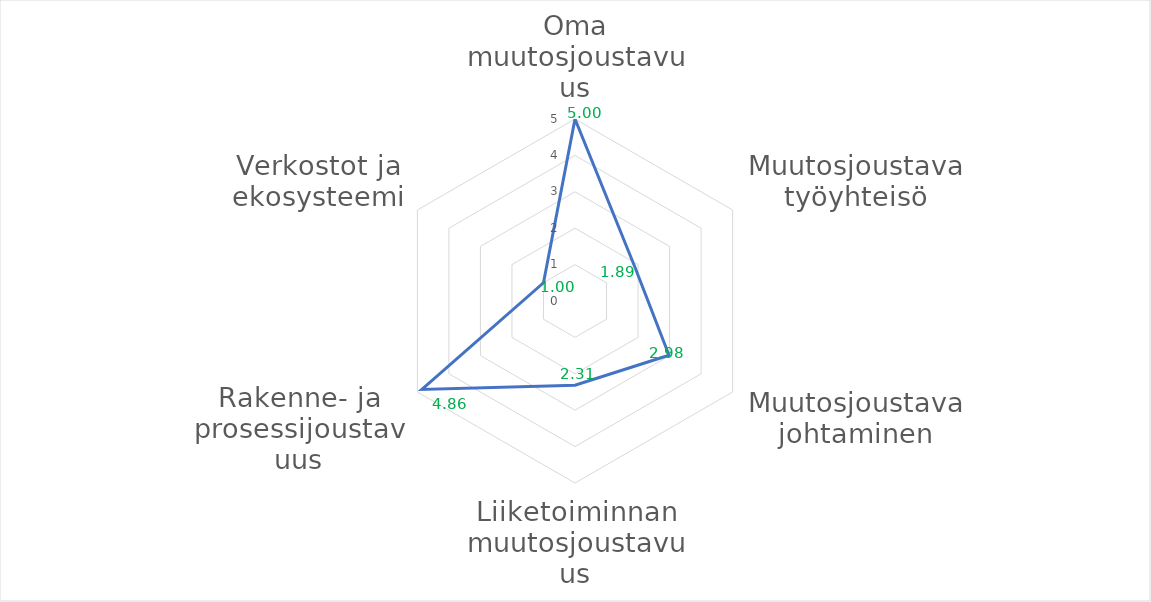
| Category | Series 0 |
|---|---|
| Oma muutosjoustavuus | 5 |
| Muutosjoustava työyhteisö | 1.893 |
| Muutosjoustava johtaminen | 2.982 |
| Liiketoiminnan muutosjoustavuus | 2.312 |
| Rakenne- ja prosessijoustavuus | 4.857 |
| Verkostot ja ekosysteemi | 1 |